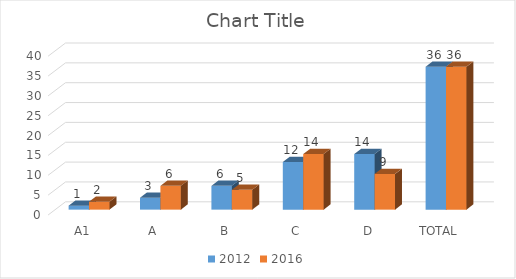
| Category | 2012 | 2016 |
|---|---|---|
| A1 | 1 | 2 |
| A | 3 | 6 |
| B | 6 | 5 |
| C | 12 | 14 |
| D | 14 | 9 |
| TOTAL | 36 | 36 |